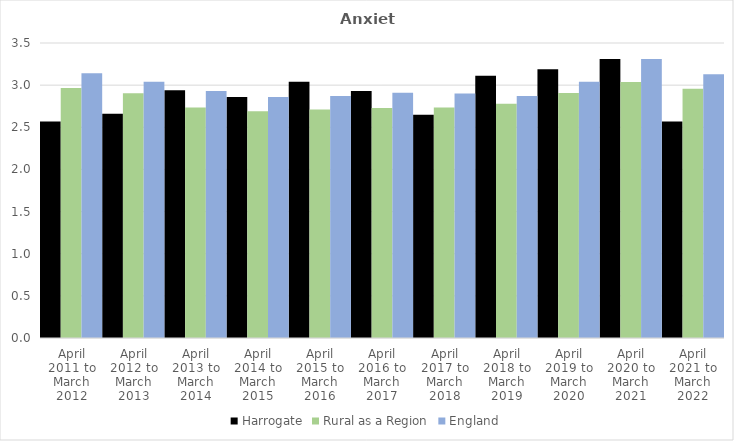
| Category | Harrogate | Rural as a Region | England |
|---|---|---|---|
| April 2011 to March 2012 | 2.57 | 2.967 | 3.14 |
| April 2012 to March 2013 | 2.66 | 2.904 | 3.04 |
| April 2013 to March 2014 | 2.94 | 2.734 | 2.93 |
| April 2014 to March 2015 | 2.86 | 2.691 | 2.86 |
| April 2015 to March 2016 | 3.04 | 2.711 | 2.87 |
| April 2016 to March 2017 | 2.93 | 2.729 | 2.91 |
| April 2017 to March 2018 | 2.65 | 2.736 | 2.9 |
| April 2018 to March 2019 | 3.11 | 2.78 | 2.87 |
| April 2019 to March 2020 | 3.19 | 2.908 | 3.04 |
| April 2020 to March 2021 | 3.31 | 3.036 | 3.31 |
| April 2021 to March 2022 | 2.57 | 2.956 | 3.13 |